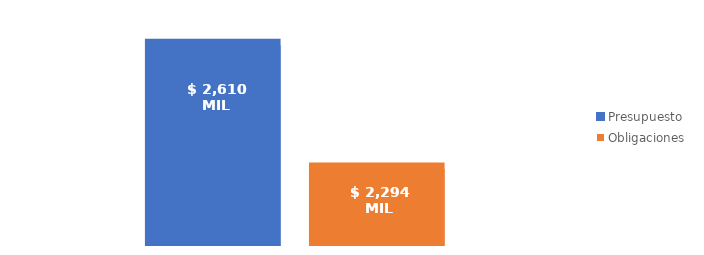
| Category | Presupuesto | Obligaciones |
|---|---|---|
| Total | 2610300182368.68 | 2294150535064.864 |